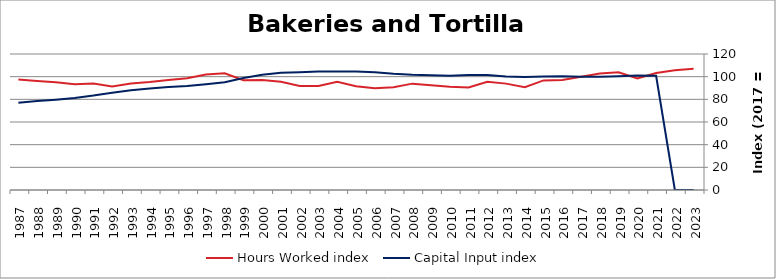
| Category | Hours Worked index | Capital Input index |
|---|---|---|
| 2023.0 | 106.886 | 0 |
| 2022.0 | 105.718 | 0 |
| 2021.0 | 103.286 | 100.82 |
| 2020.0 | 98.418 | 100.927 |
| 2019.0 | 103.842 | 100.354 |
| 2018.0 | 102.822 | 99.931 |
| 2017.0 | 100 | 100 |
| 2016.0 | 97.044 | 100.368 |
| 2015.0 | 96.724 | 100.086 |
| 2014.0 | 90.725 | 99.811 |
| 2013.0 | 93.859 | 100.04 |
| 2012.0 | 95.488 | 101.385 |
| 2011.0 | 90.376 | 101.49 |
| 2010.0 | 91.154 | 100.885 |
| 2009.0 | 92.427 | 101.284 |
| 2008.0 | 93.847 | 101.633 |
| 2007.0 | 90.614 | 102.567 |
| 2006.0 | 89.796 | 103.971 |
| 2005.0 | 91.608 | 104.662 |
| 2004.0 | 95.385 | 104.616 |
| 2003.0 | 91.818 | 104.466 |
| 2002.0 | 91.721 | 103.959 |
| 2001.0 | 95.519 | 103.38 |
| 2000.0 | 96.995 | 101.639 |
| 1999.0 | 96.82 | 98.744 |
| 1998.0 | 102.96 | 95.102 |
| 1997.0 | 101.934 | 93.259 |
| 1996.0 | 98.541 | 91.693 |
| 1995.0 | 97.037 | 90.779 |
| 1994.0 | 95.294 | 89.537 |
| 1993.0 | 93.987 | 87.928 |
| 1992.0 | 91.433 | 85.794 |
| 1991.0 | 93.938 | 83.292 |
| 1990.0 | 93.211 | 81.242 |
| 1989.0 | 94.98 | 79.688 |
| 1988.0 | 96.171 | 78.427 |
| 1987.0 | 97.581 | 76.931 |